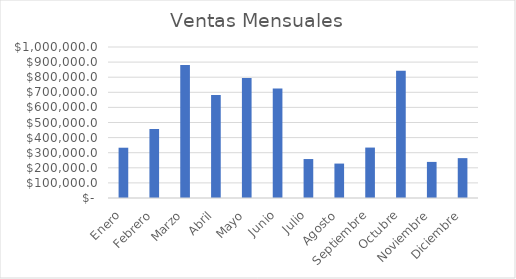
| Category | Monto |
|---|---|
| Enero | 333000 |
| Febrero | 457000 |
| Marzo | 881000 |
| Abril | 682000 |
| Mayo | 795000 |
| Junio | 725000 |
| Julio | 258000 |
| Agosto | 228000 |
| Septiembre | 334000 |
| Octubre | 842000 |
| Noviembre | 239000 |
| Diciembre | 264000 |